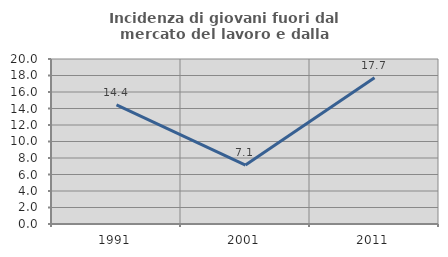
| Category | Incidenza di giovani fuori dal mercato del lavoro e dalla formazione  |
|---|---|
| 1991.0 | 14.437 |
| 2001.0 | 7.143 |
| 2011.0 | 17.722 |